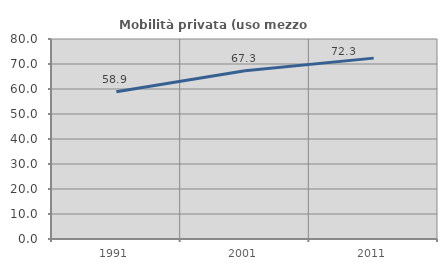
| Category | Mobilità privata (uso mezzo privato) |
|---|---|
| 1991.0 | 58.891 |
| 2001.0 | 67.333 |
| 2011.0 | 72.35 |